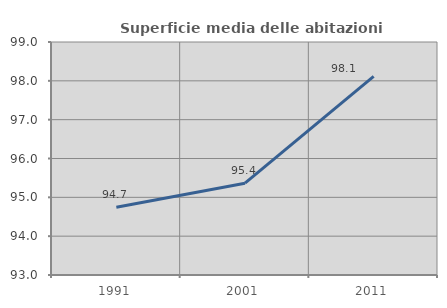
| Category | Superficie media delle abitazioni occupate |
|---|---|
| 1991.0 | 94.742 |
| 2001.0 | 95.364 |
| 2011.0 | 98.113 |